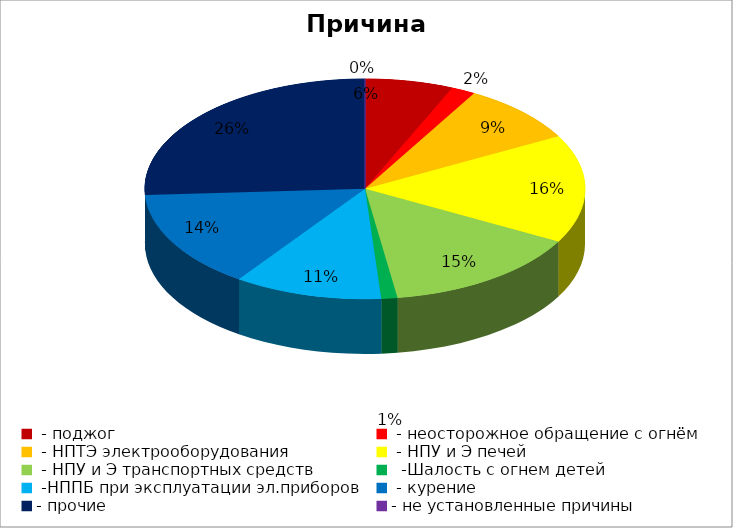
| Category | Причина пожара |
|---|---|
|  - поджог | 22 |
|  - неосторожное обращение с огнём | 6 |
|  - НПТЭ электрооборудования | 30 |
|  - НПУ и Э печей | 54 |
|  - НПУ и Э транспортных средств | 50 |
|   -Шалость с огнем детей | 4 |
|  -НППБ при эксплуатации эл.приборов | 37 |
|  - курение | 49 |
| - прочие | 88 |
| - не установленные причины | 0 |